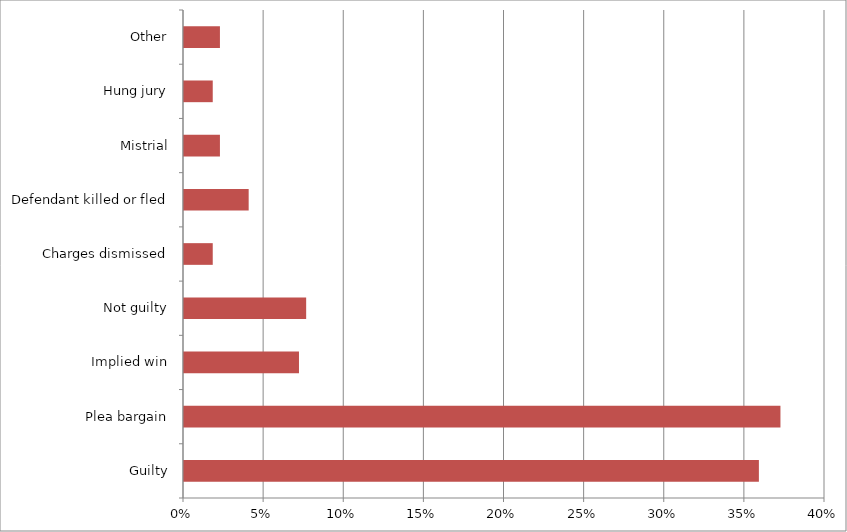
| Category | Series 1 |
|---|---|
| Guilty | 0.359 |
| Plea bargain | 0.372 |
| Implied win | 0.072 |
| Not guilty | 0.076 |
| Charges dismissed | 0.018 |
| Defendant killed or fled | 0.04 |
| Mistrial | 0.022 |
| Hung jury | 0.018 |
| Other | 0.022 |